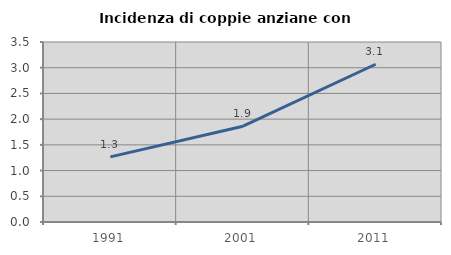
| Category | Incidenza di coppie anziane con figli |
|---|---|
| 1991.0 | 1.266 |
| 2001.0 | 1.863 |
| 2011.0 | 3.067 |